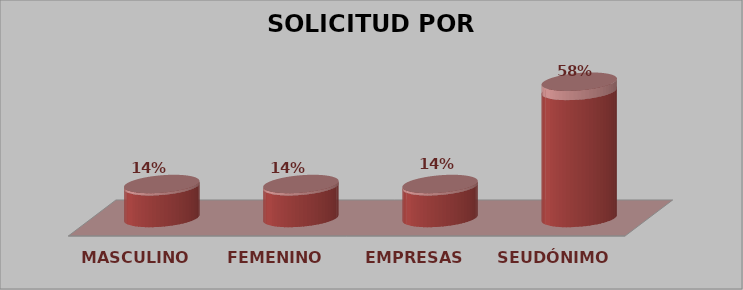
| Category | SOLICITUD POR GÉNERO | Series 1 |
|---|---|---|
| MASCULINO | 2 | 0.14 |
| FEMENINO | 2 | 0.14 |
| EMPRESAS | 2 | 0.14 |
| SEUDÓNIMO | 8 | 0.58 |